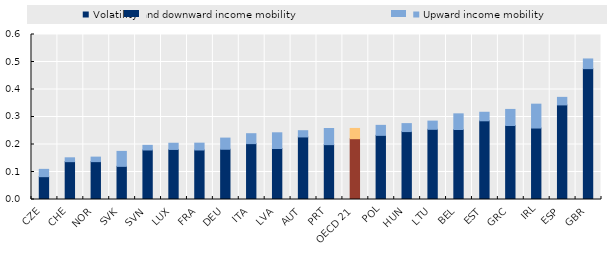
| Category | Volatility and downward income mobility | Upward income mobility |
|---|---|---|
| CZE | 0.083 | 0.027 |
| CHE | 0.138 | 0.014 |
| NOR | 0.138 | 0.016 |
| SVK | 0.121 | 0.054 |
| SVN | 0.18 | 0.017 |
| LUX | 0.182 | 0.023 |
| FRA | 0.18 | 0.025 |
| DEU | 0.183 | 0.041 |
| ITA | 0.203 | 0.036 |
| LVA | 0.185 | 0.057 |
| AUT | 0.227 | 0.023 |
| PRT | 0.2 | 0.059 |
| OECD 21 | 0.221 | 0.037 |
| POL | 0.233 | 0.036 |
| HUN | 0.247 | 0.029 |
| LTU | 0.255 | 0.03 |
| BEL | 0.254 | 0.057 |
| EST | 0.286 | 0.031 |
| GRC | 0.269 | 0.058 |
| IRL | 0.26 | 0.087 |
| ESP | 0.344 | 0.027 |
| GBR | 0.476 | 0.035 |